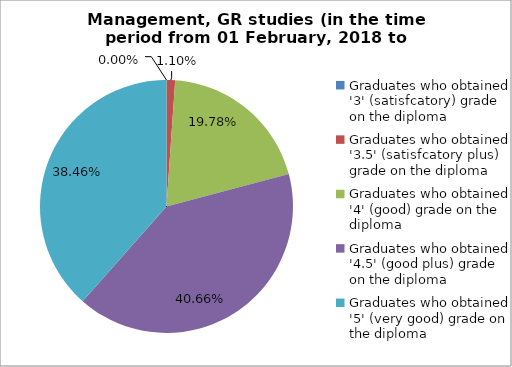
| Category | Series 0 |
|---|---|
| Graduates who obtained '3' (satisfcatory) grade on the diploma | 0 |
| Graduates who obtained '3.5' (satisfcatory plus) grade on the diploma | 1.099 |
| Graduates who obtained '4' (good) grade on the diploma | 19.78 |
| Graduates who obtained '4.5' (good plus) grade on the diploma | 40.659 |
| Graduates who obtained '5' (very good) grade on the diploma | 38.462 |